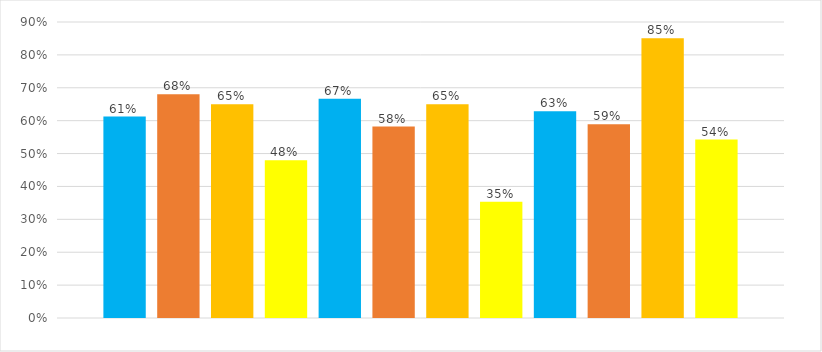
| Category | Series 0 | Series 1 | Series 2 | Series 3 | Series 4 | Series 5 | Series 6 | Series 7 | Series 8 | Series 9 | Series 10 | Series 11 |
|---|---|---|---|---|---|---|---|---|---|---|---|---|
| 0 | 0.612 | 0.68 | 0.65 | 0.48 | 0.667 | 0.582 | 0.65 | 0.353 | 0.628 | 0.589 | 0.851 | 0.543 |